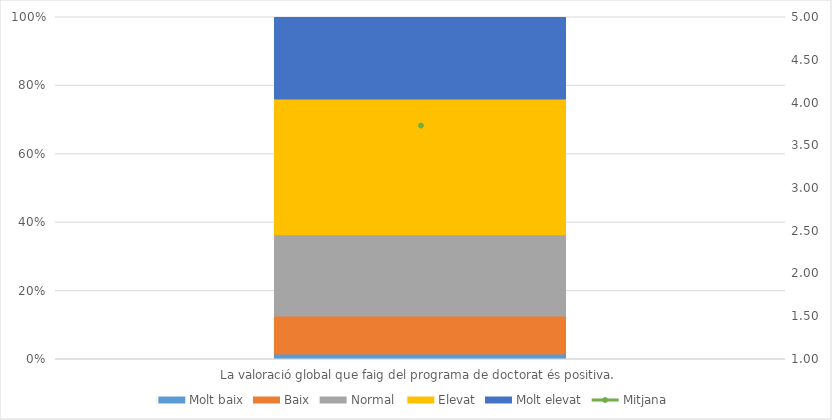
| Category | Molt baix | Baix | Normal  | Elevat | Molt elevat |
|---|---|---|---|---|---|
| La valoració global que faig del programa de doctorat és positiva. | 1 | 7 | 15 | 25 | 15 |